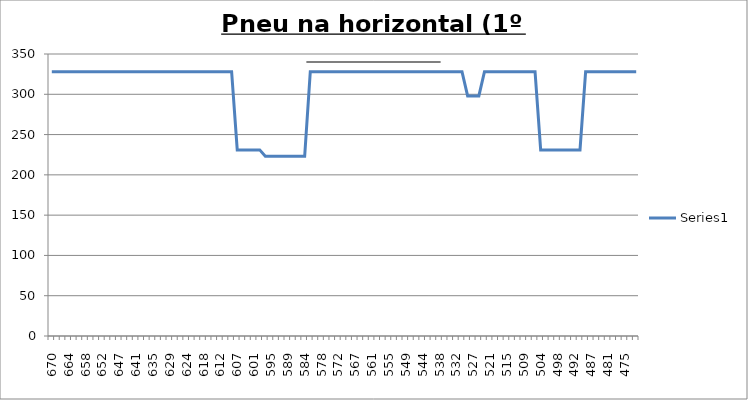
| Category | Series 0 |
|---|---|
| 670.0 | 328 |
| 668.0 | 328 |
| 666.0 | 328 |
| 664.0 | 328 |
| 662.0 | 328 |
| 660.0 | 328 |
| 658.0 | 328 |
| 656.0 | 328 |
| 654.0 | 328 |
| 652.0 | 328 |
| 650.0 | 328 |
| 649.0 | 328 |
| 647.0 | 328 |
| 645.0 | 328 |
| 643.0 | 328 |
| 641.0 | 328 |
| 639.0 | 328 |
| 637.0 | 328 |
| 635.0 | 328 |
| 633.0 | 328 |
| 631.0 | 328 |
| 629.0 | 328 |
| 628.0 | 328 |
| 626.0 | 328 |
| 624.0 | 328 |
| 622.0 | 328 |
| 620.0 | 328 |
| 618.0 | 328 |
| 616.0 | 328 |
| 614.0 | 328 |
| 612.0 | 328 |
| 610.0 | 328 |
| 609.0 | 328 |
| 607.0 | 231 |
| 605.0 | 231 |
| 603.0 | 231 |
| 601.0 | 231 |
| 599.0 | 231 |
| 597.0 | 223 |
| 595.0 | 223 |
| 593.0 | 223 |
| 591.0 | 223 |
| 589.0 | 223 |
| 588.0 | 223 |
| 586.0 | 223 |
| 584.0 | 223 |
| 582.0 | 328 |
| 580.0 | 328 |
| 578.0 | 328 |
| 576.0 | 328 |
| 574.0 | 328 |
| 572.0 | 328 |
| 570.0 | 328 |
| 569.0 | 328 |
| 567.0 | 328 |
| 565.0 | 328 |
| 563.0 | 328 |
| 561.0 | 328 |
| 559.0 | 328 |
| 557.0 | 328 |
| 555.0 | 328 |
| 553.0 | 328 |
| 551.0 | 328 |
| 549.0 | 328 |
| 548.0 | 328 |
| 546.0 | 328 |
| 544.0 | 328 |
| 542.0 | 328 |
| 540.0 | 328 |
| 538.0 | 328 |
| 536.0 | 328 |
| 534.0 | 328 |
| 532.0 | 328 |
| 530.0 | 328 |
| 529.0 | 298 |
| 527.0 | 298 |
| 525.0 | 298 |
| 523.0 | 328 |
| 521.0 | 328 |
| 519.0 | 328 |
| 517.0 | 328 |
| 515.0 | 328 |
| 513.0 | 328 |
| 511.0 | 328 |
| 509.0 | 328 |
| 508.0 | 328 |
| 506.0 | 328 |
| 504.0 | 231 |
| 502.0 | 231 |
| 500.0 | 231 |
| 498.0 | 231 |
| 496.0 | 231 |
| 494.0 | 231 |
| 492.0 | 231 |
| 490.0 | 231 |
| 489.0 | 328 |
| 487.0 | 328 |
| 485.0 | 328 |
| 483.0 | 328 |
| 481.0 | 328 |
| 479.0 | 328 |
| 477.0 | 328 |
| 475.0 | 328 |
| 473.0 | 328 |
| 471.0 | 328 |